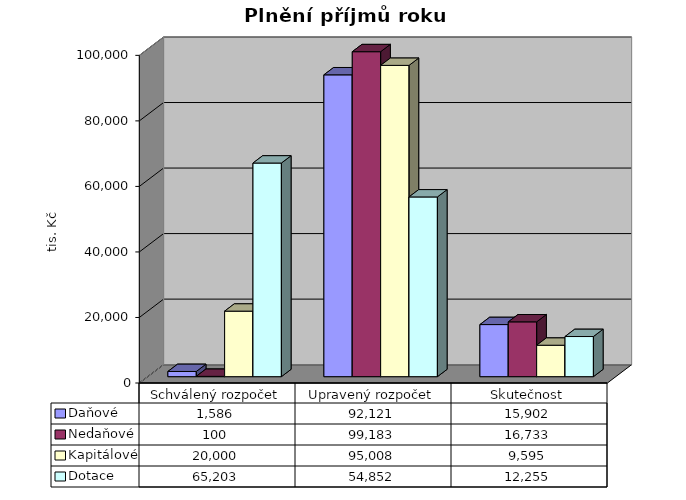
| Category | Daňové | Nedaňové | Kapitálové | Dotace |
|---|---|---|---|---|
| Schválený rozpočet | 1586 | 100 | 20000 | 65203 |
| Upravený rozpočet | 92121 | 99183 | 95008 | 54852 |
| Skutečnost | 15902 | 16733 | 9595 | 12255 |